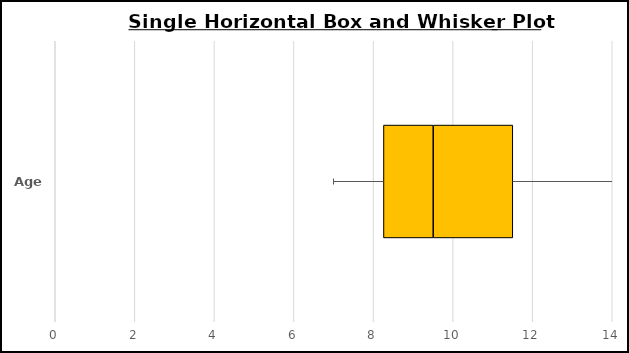
| Category | Bottom Box | Q2 Box | Q3 Box |
|---|---|---|---|
| Age | 8.25 | 1.25 | 2 |